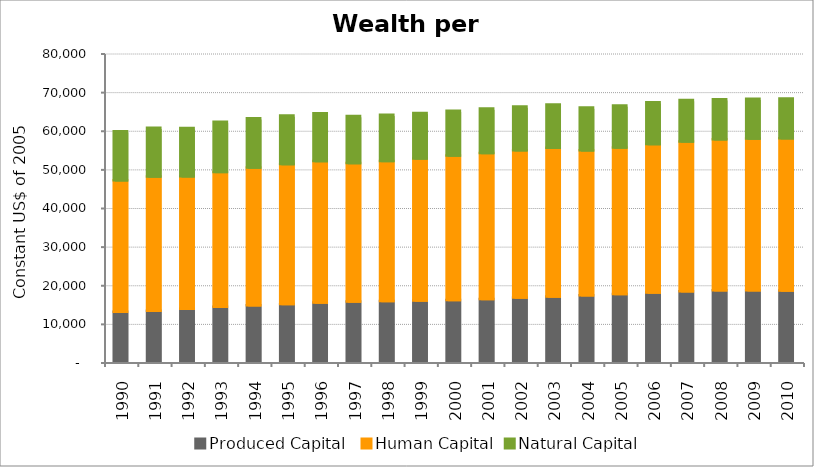
| Category | Produced Capital  | Human Capital | Natural Capital |
|---|---|---|---|
| 1990.0 | 12967.792 | 34012.386 | 12719.752 |
| 1991.0 | 13225.395 | 34737.444 | 12625.522 |
| 1992.0 | 13723.548 | 34272.23 | 12520.883 |
| 1993.0 | 14209.097 | 34943.94 | 12961.17 |
| 1994.0 | 14632.295 | 35631.25 | 12776.346 |
| 1995.0 | 14977.842 | 36193.033 | 12590.564 |
| 1996.0 | 15313.391 | 36638.907 | 12402.449 |
| 1997.0 | 15610.174 | 35823.966 | 12173.096 |
| 1998.0 | 15750.132 | 36234.755 | 11945.31 |
| 1999.0 | 15831.675 | 36811.642 | 11781.865 |
| 2000.0 | 15997.31 | 37398.09 | 11606.375 |
| 2001.0 | 16274.466 | 37773.567 | 11495.282 |
| 2002.0 | 16602.419 | 38165.683 | 11295.579 |
| 2003.0 | 16894.039 | 38540.254 | 11198.233 |
| 2004.0 | 17198.016 | 37530.928 | 11072.235 |
| 2005.0 | 17521.864 | 37943.009 | 10899.555 |
| 2006.0 | 17922.344 | 38426.663 | 10826.18 |
| 2007.0 | 18259.278 | 38790.019 | 10706.739 |
| 2008.0 | 18486.828 | 39117.767 | 10375.345 |
| 2009.0 | 18535.279 | 39233.005 | 10326.52 |
| 2010.0 | 18447.317 | 39423.547 | 10278.557 |